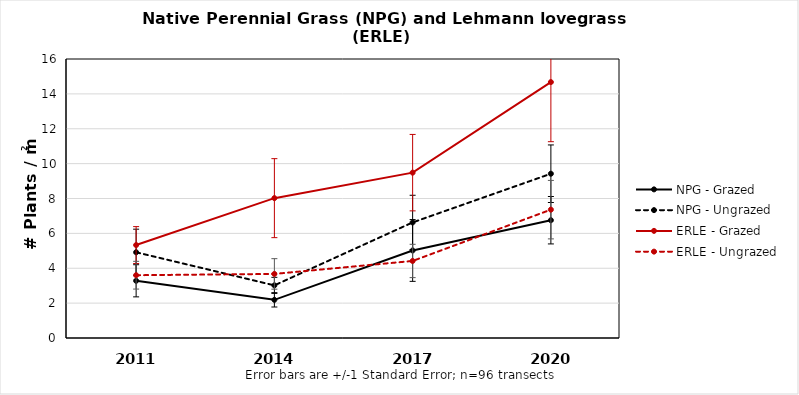
| Category | NPG - Grazed | NPG - Ungrazed | ERLE - Grazed | ERLE - Ungrazed |
|---|---|---|---|---|
| 2011.0 | 3.281 | 4.916 | 5.329 | 3.601 |
| 2014.0 | 2.189 | 3.019 | 8.02 | 3.675 |
| 2017.0 | 5.02 | 6.628 | 9.483 | 4.418 |
| 2020.0 | 6.754 | 9.421 | 14.676 | 7.36 |